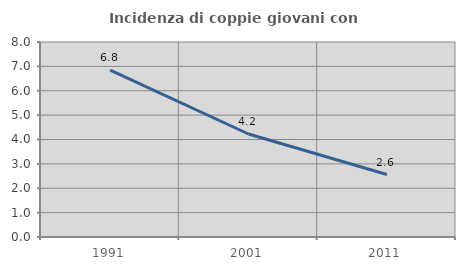
| Category | Incidenza di coppie giovani con figli |
|---|---|
| 1991.0 | 6.849 |
| 2001.0 | 4.225 |
| 2011.0 | 2.564 |